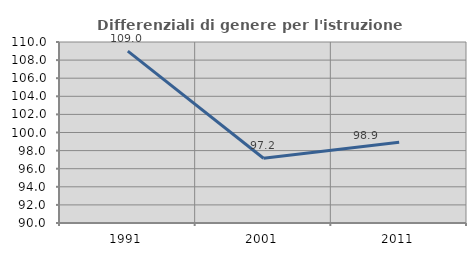
| Category | Differenziali di genere per l'istruzione superiore |
|---|---|
| 1991.0 | 108.991 |
| 2001.0 | 97.16 |
| 2011.0 | 98.932 |